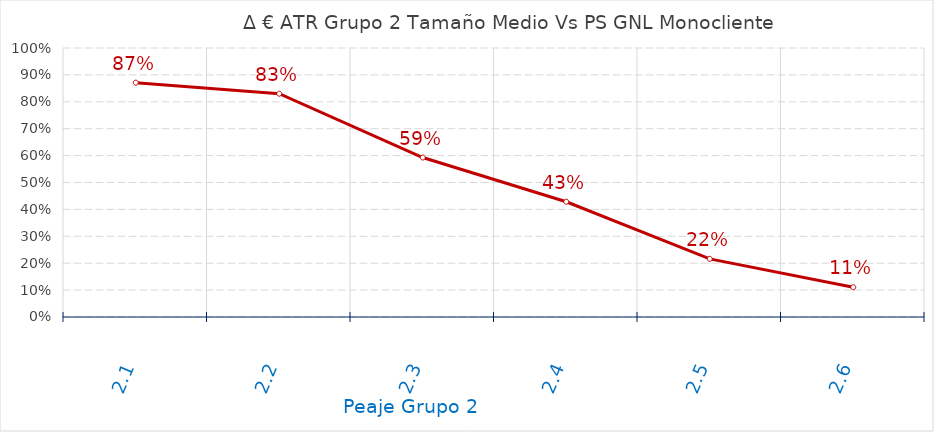
| Category | D €/año |
|---|---|
| 2.1 | 0.871 |
| 2.2 | 0.83 |
| 2.3 | 0.593 |
| 2.4 | 0.428 |
| 2.5 | 0.216 |
| 2.6 | 0.11 |